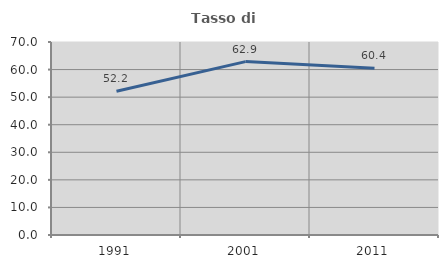
| Category | Tasso di occupazione   |
|---|---|
| 1991.0 | 52.166 |
| 2001.0 | 62.887 |
| 2011.0 | 60.438 |